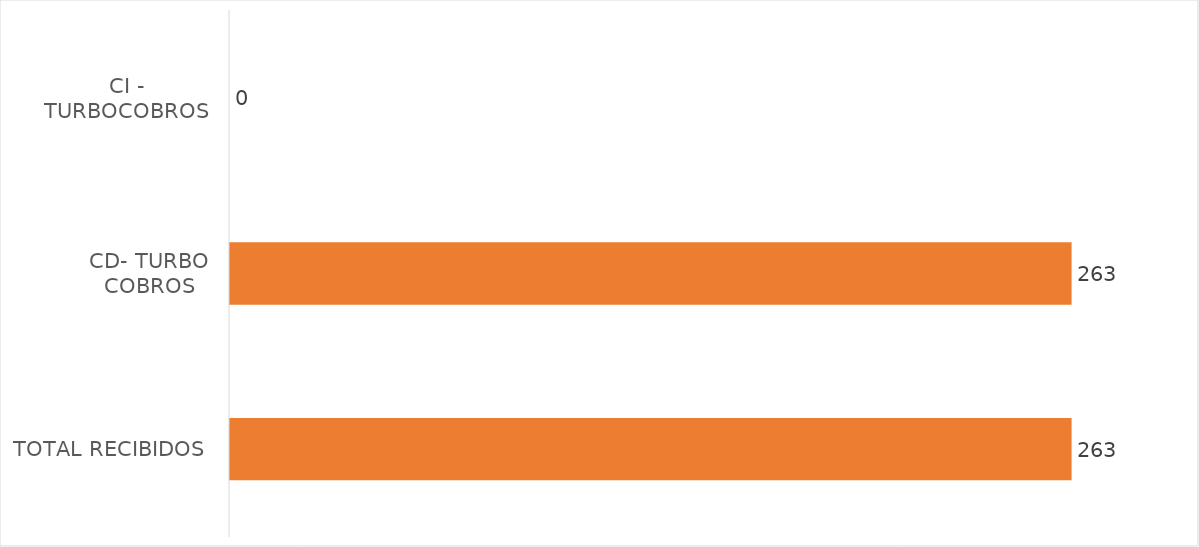
| Category | Series 0 |
|---|---|
| TOTAL RECIBIDOS | 263 |
| CD- TURBO COBROS | 263 |
| CI - TURBOCOBROS | 0 |